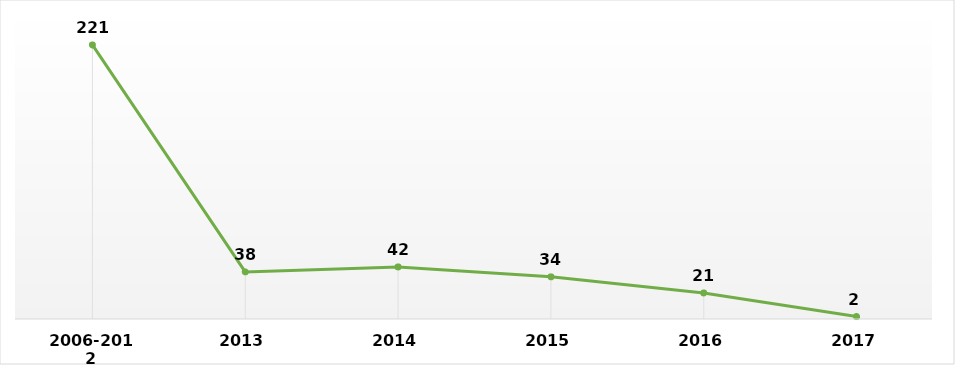
| Category | Total |
|---|---|
| 2006-2012 | 221 |
| 2013 | 38 |
| 2014 | 42 |
| 2015 | 34 |
| 2016 | 21 |
| 2017 | 2 |